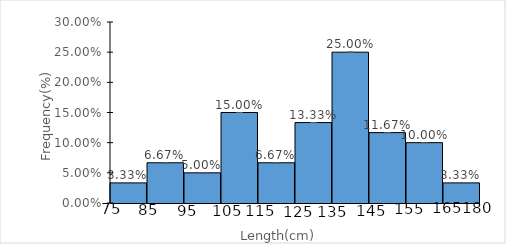
| Category | Series 0 |
|---|---|
| ]75,85] | 0.033 |
| ]85,95] | 0.067 |
| ]95,105] | 0.05 |
| ]105,115] | 0.15 |
| ]115,125] | 0.067 |
| ]125,135] | 0.133 |
| ]135,145] | 0.25 |
| ]145,155] | 0.117 |
| ]155,165] | 0.1 |
| ]165,180] | 0.033 |